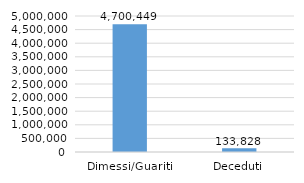
| Category | Italia |
|---|---|
| Dimessi/Guariti | 4700449 |
| Deceduti | 133828 |